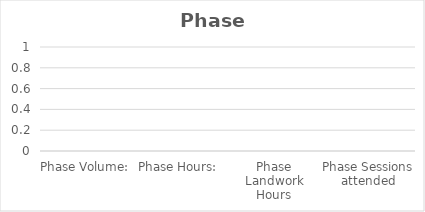
| Category | Total |
|---|---|
| Phase Volume:  | 0 |
| Phase Hours:  | 0 |
| Phase Landwork Hours | 0 |
| Phase Sessions attended | 0 |